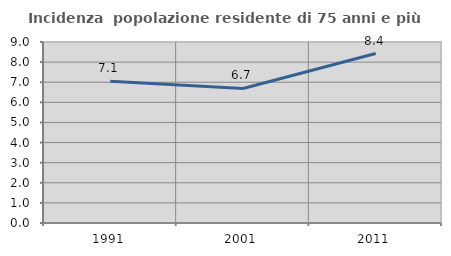
| Category | Incidenza  popolazione residente di 75 anni e più |
|---|---|
| 1991.0 | 7.05 |
| 2001.0 | 6.691 |
| 2011.0 | 8.426 |